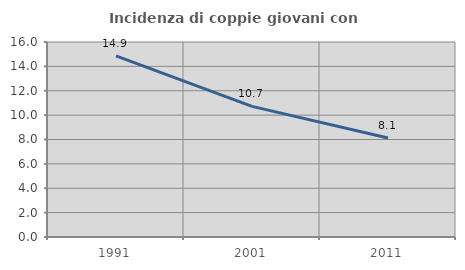
| Category | Incidenza di coppie giovani con figli |
|---|---|
| 1991.0 | 14.856 |
| 2001.0 | 10.716 |
| 2011.0 | 8.123 |